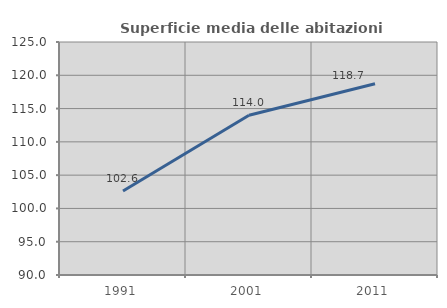
| Category | Superficie media delle abitazioni occupate |
|---|---|
| 1991.0 | 102.613 |
| 2001.0 | 113.997 |
| 2011.0 | 118.719 |